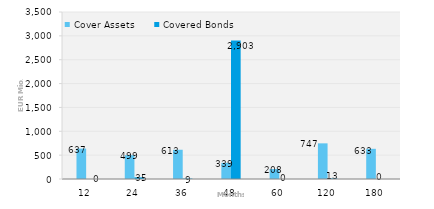
| Category | Cover Assets | Covered Bonds |
|---|---|---|
| 12.0 | 637.257 | 0 |
| 24.0 | 498.705 | 35 |
| 36.0 | 612.833 | 9.108 |
| 48.0 | 339.373 | 2903 |
| 60.0 | 208.424 | 0 |
| 120.0 | 747.129 | 13 |
| 180.0 | 632.576 | 0 |